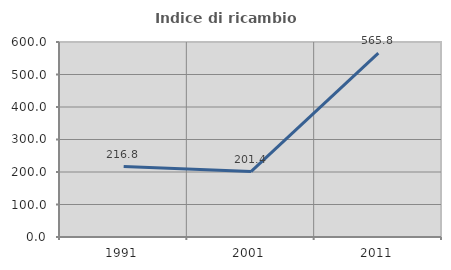
| Category | Indice di ricambio occupazionale  |
|---|---|
| 1991.0 | 216.842 |
| 2001.0 | 201.351 |
| 2011.0 | 565.789 |